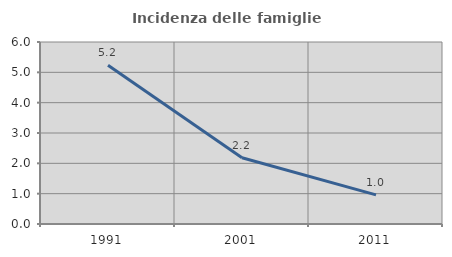
| Category | Incidenza delle famiglie numerose |
|---|---|
| 1991.0 | 5.236 |
| 2001.0 | 2.182 |
| 2011.0 | 0.96 |